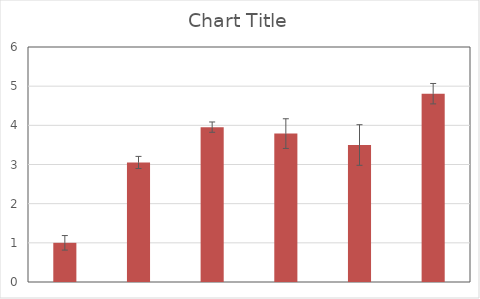
| Category | Series 1 |
|---|---|
| 0 | 1 |
| 1 | 3.052 |
| 2 | 3.954 |
| 3 | 3.789 |
| 4 | 3.498 |
| 5 | 4.808 |